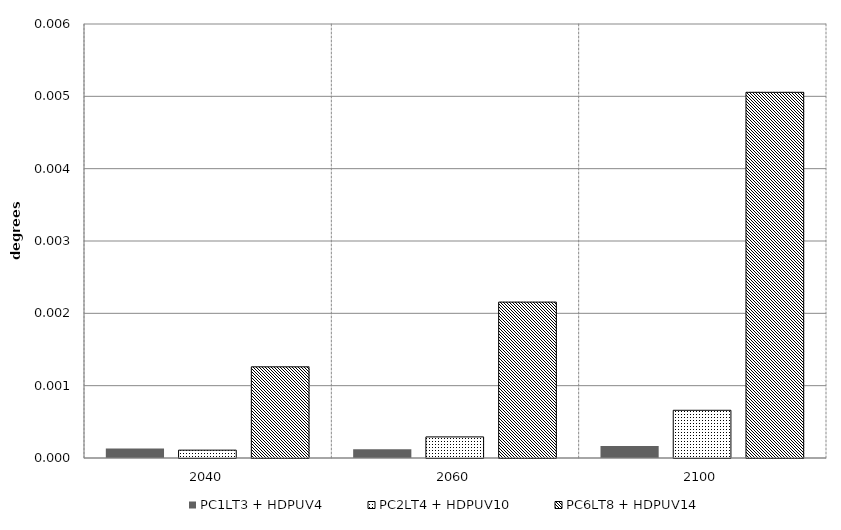
| Category | PC1LT3 + HDPUV4 | PC2LT4 + HDPUV10 | PC6LT8 + HDPUV14 | Alt 5 | Alt 6 | Alt 7 | Alt 8 | Alt 10 |
|---|---|---|---|---|---|---|---|---|
| 2040.0 | 0 | 0 | 0.001 |  |  |  |  |  |
| 2060.0 | 0 | 0 | 0.002 |  |  |  |  |  |
| 2100.0 | 0 | 0.001 | 0.005 |  |  |  |  |  |